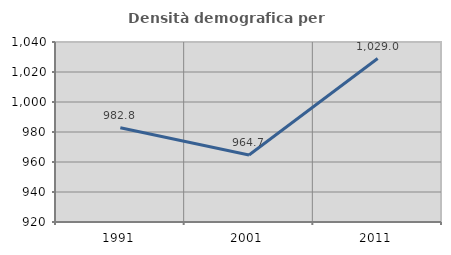
| Category | Densità demografica |
|---|---|
| 1991.0 | 982.806 |
| 2001.0 | 964.652 |
| 2011.0 | 1028.958 |